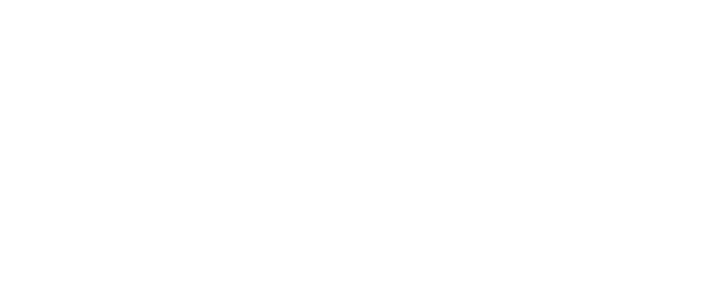
| Category | 2009 | 2010 | 2011 | 2012 | 2013 | 2015 | 2016 | 2017 | 2018 | 2019 |
|---|---|---|---|---|---|---|---|---|---|---|
| Suma | 100 | 72 | 98 | 92 | 84 | 60 | 60 | 96 | 65 | 75 |